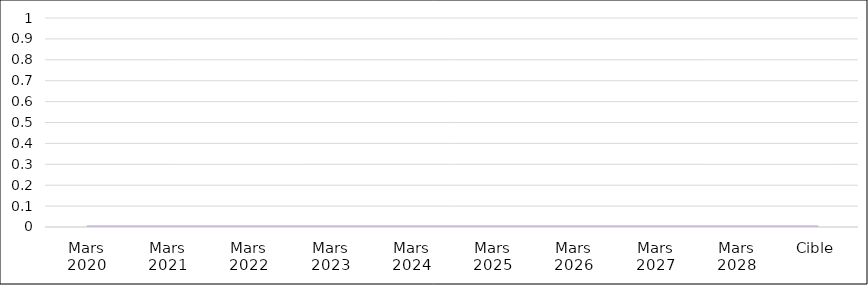
| Category | Series 0 |
|---|---|
| Mars 2020 | 0 |
| Mars 2021 | 0 |
| Mars 2022 | 0 |
| Mars 2023 | 0 |
| Mars 2024 | 0 |
| Mars 2025 | 0 |
| Mars 2026 | 0 |
| Mars 2027 | 0 |
| Mars 2028 | 0 |
| Cible | 0 |